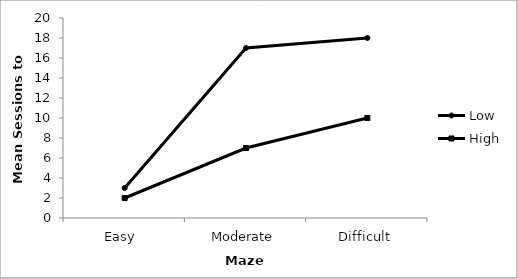
| Category | Low | High |
|---|---|---|
| Easy  | 3 | 2 |
| Moderate | 17 | 7 |
| Difficult | 18 | 10 |